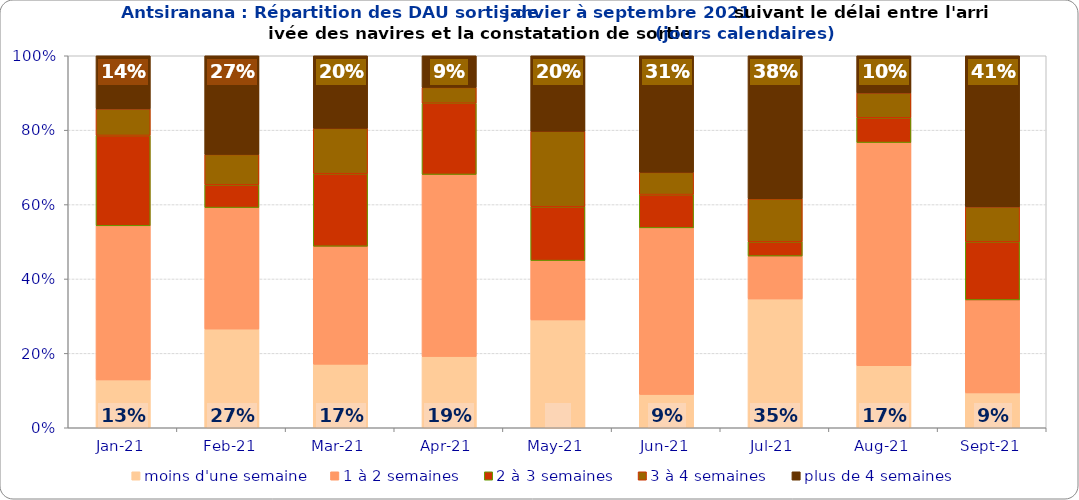
| Category | moins d'une semaine | 1 à 2 semaines | 2 à 3 semaines | 3 à 4 semaines | plus de 4 semaines |
|---|---|---|---|---|---|
| 2021-01-01 | 0.129 | 0.414 | 0.243 | 0.071 | 0.143 |
| 2021-02-01 | 0.265 | 0.327 | 0.061 | 0.082 | 0.265 |
| 2021-03-01 | 0.171 | 0.317 | 0.195 | 0.122 | 0.195 |
| 2021-04-01 | 0.191 | 0.489 | 0.191 | 0.043 | 0.085 |
| 2021-05-01 | 0.29 | 0.159 | 0.145 | 0.203 | 0.203 |
| 2021-06-01 | 0.09 | 0.448 | 0.09 | 0.06 | 0.313 |
| 2021-07-01 | 0.346 | 0.115 | 0.038 | 0.115 | 0.385 |
| 2021-08-01 | 0.167 | 0.6 | 0.067 | 0.067 | 0.1 |
| 2021-09-01 | 0.094 | 0.25 | 0.156 | 0.094 | 0.406 |